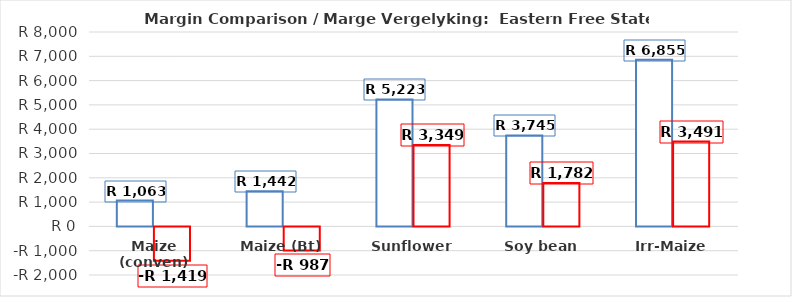
| Category | 3) GROSS MARGIN  (R/ha) | 4) NETT MARGIN  (R/ha) |
|---|---|---|
| Maize (conven) | 1063.272 | -1418.668 |
| Maize (Bt) | 1441.527 | -987.143 |
| Sunflower | 5223.458 | 3348.908 |
| Soy bean | 3745.239 | 1782.009 |
| Irr-Maize | 6854.791 | 3490.751 |